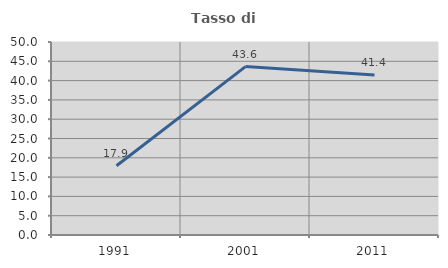
| Category | Tasso di occupazione   |
|---|---|
| 1991.0 | 17.934 |
| 2001.0 | 43.626 |
| 2011.0 | 41.435 |